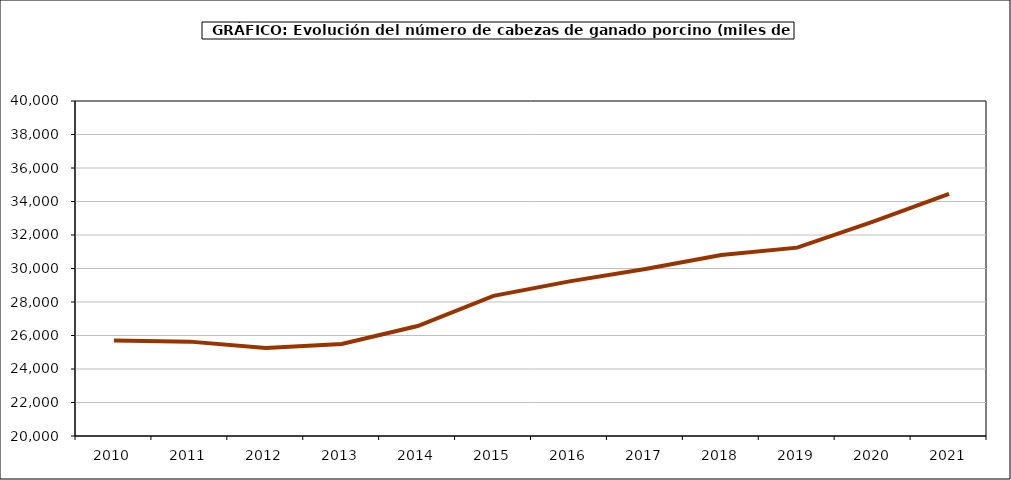
| Category | Total porcino |
|---|---|
| 2010.0 | 25704 |
| 2011.0 | 25634 |
| 2012.0 | 25250.377 |
| 2013.0 | 25494.715 |
| 2014.0 | 26567.578 |
| 2015.0 | 28367.335 |
| 2016.0 | 29231.595 |
| 2017.0 | 29971.357 |
| 2018.0 | 30804.102 |
| 2019.0 | 31246 |
| 2020.0 | 32795 |
| 2021.0 | 34455 |